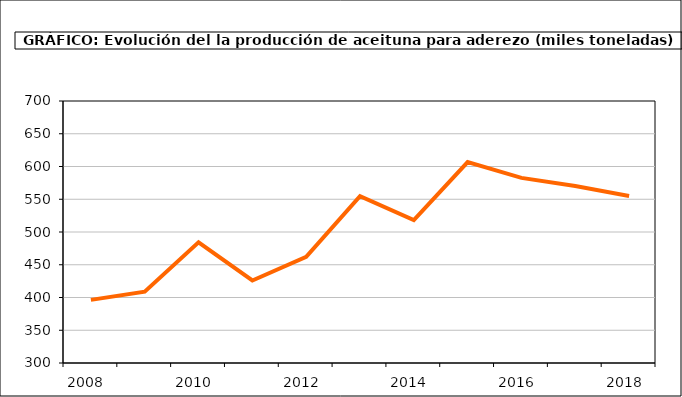
| Category | producción |
|---|---|
| 2008.0 | 396.4 |
| 2009.0 | 408.897 |
| 2010.0 | 484.197 |
| 2011.0 | 425.955 |
| 2012.0 | 461.963 |
| 2013.0 | 554.749 |
| 2014.0 | 518.23 |
| 2015.0 | 606.789 |
| 2016.0 | 582.648 |
| 2017.0 | 570.295 |
| 2018.0 | 555.033 |